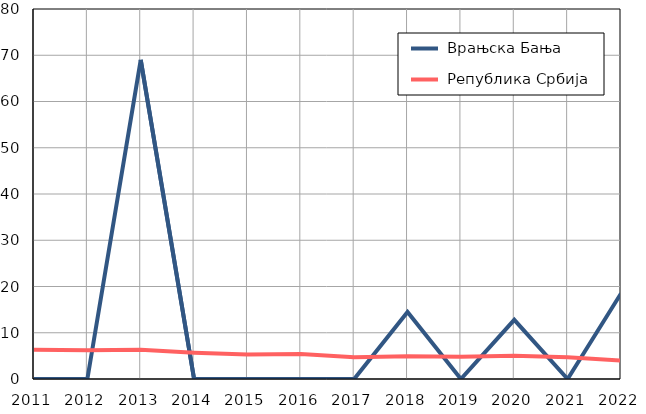
| Category |  Врањска Бања |  Република Србија |
|---|---|---|
| 2011.0 | 0 | 6.3 |
| 2012.0 | 0 | 6.2 |
| 2013.0 | 69 | 6.3 |
| 2014.0 | 0 | 5.7 |
| 2015.0 | 0 | 5.3 |
| 2016.0 | 0 | 5.4 |
| 2017.0 | 0 | 4.7 |
| 2018.0 | 14.5 | 4.9 |
| 2019.0 | 0 | 4.8 |
| 2020.0 | 12.8 | 5 |
| 2021.0 | 0 | 4.7 |
| 2022.0 | 18.5 | 4 |